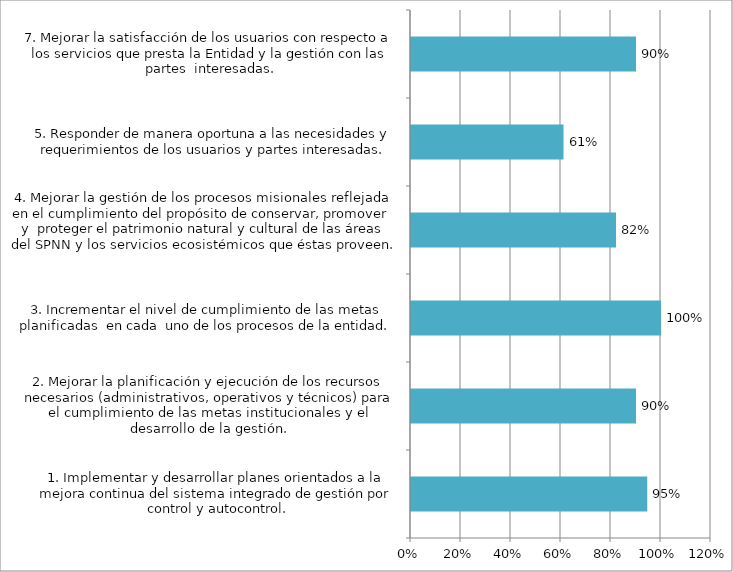
| Category | Series 0 |
|---|---|
| 1. Implementar y desarrollar planes orientados a la mejora continua del sistema integrado de gestión por control y autocontrol. | 0.945 |
| 2. Mejorar la planificación y ejecución de los recursos necesarios (administrativos, operativos y técnicos) para el cumplimiento de las metas institucionales y el desarrollo de la gestión. | 0.9 |
| 3. Incrementar el nivel de cumplimiento de las metas planificadas  en cada  uno de los procesos de la entidad. | 1 |
| 4. Mejorar la gestión de los procesos misionales reflejada en el cumplimiento del propósito de conservar, promover  y  proteger el patrimonio natural y cultural de las áreas del SPNN y los servicios ecosistémicos que éstas proveen.  | 0.82 |
| 5. Responder de manera oportuna a las necesidades y requerimientos de los usuarios y partes interesadas. | 0.61 |
| 7. Mejorar la satisfacción de los usuarios con respecto a los servicios que presta la Entidad y la gestión con las partes  interesadas. | 0.9 |